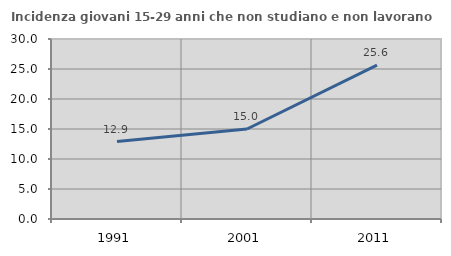
| Category | Incidenza giovani 15-29 anni che non studiano e non lavorano  |
|---|---|
| 1991.0 | 12.903 |
| 2001.0 | 15 |
| 2011.0 | 25.641 |